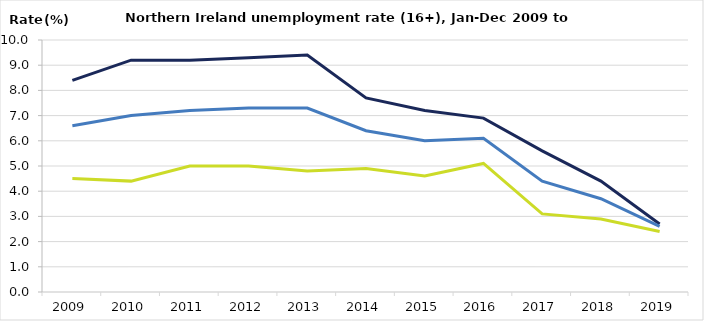
| Category | Male | Female | Total |
|---|---|---|---|
| 2009.0 | 8.4 | 4.5 | 6.6 |
| 2010.0 | 9.2 | 4.4 | 7 |
| 2011.0 | 9.2 | 5 | 7.2 |
| 2012.0 | 9.3 | 5 | 7.3 |
| 2013.0 | 9.4 | 4.8 | 7.3 |
| 2014.0 | 7.7 | 4.9 | 6.4 |
| 2015.0 | 7.2 | 4.6 | 6 |
| 2016.0 | 6.9 | 5.1 | 6.1 |
| 2017.0 | 5.6 | 3.1 | 4.4 |
| 2018.0 | 4.4 | 2.9 | 3.7 |
| 2019.0 | 2.7 | 2.4 | 2.6 |